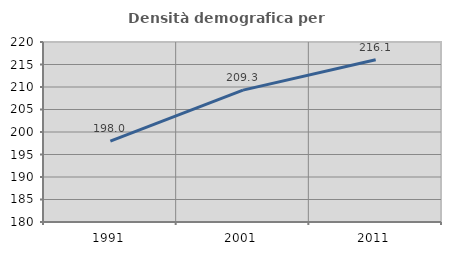
| Category | Densità demografica |
|---|---|
| 1991.0 | 197.957 |
| 2001.0 | 209.306 |
| 2011.0 | 216.059 |